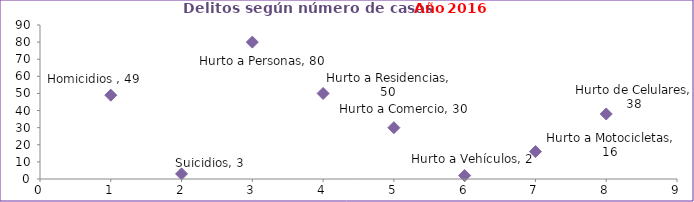
| Category | Series 0 |
|---|---|
| 0 | 49 |
| 1 | 3 |
| 2 | 80 |
| 3 | 50 |
| 4 | 30 |
| 5 | 2 |
| 6 | 16 |
| 7 | 38 |